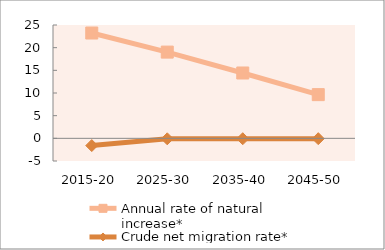
| Category | Annual rate of natural increase* | Crude net migration rate* |
|---|---|---|
| 2015-20 | 23.229 | -1.595 |
| 2025-30 | 19.02 | -0.104 |
| 2035-40 | 14.412 | -0.088 |
| 2045-50 | 9.639 | -0.078 |